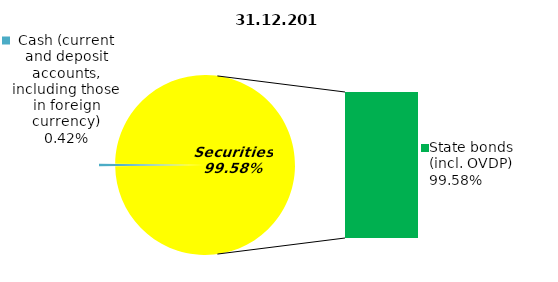
| Category | Series 0 |
|---|---|
| Cash (current and deposit accounts, including those in foreign currency) | 0.41 |
| Bank metals | 0 |
| Real estate | 0 |
| Other assets | 0 |
| Equities | 0 |
| Corporate bonds | 0 |
| Municipal bonds | 0 |
| State bonds (incl. OVDP) | 96.244 |
| Mortgage Certificates | 0 |